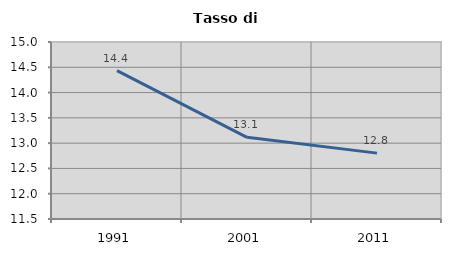
| Category | Tasso di disoccupazione   |
|---|---|
| 1991.0 | 14.433 |
| 2001.0 | 13.115 |
| 2011.0 | 12.803 |